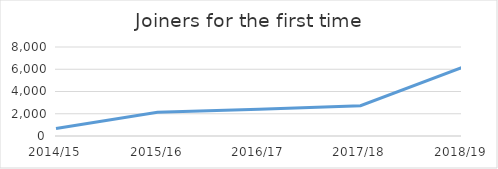
| Category | Joiners for the first time |
|---|---|
| 2014/15 | 665 |
| 2015/16 | 2135 |
| 2016/17 | 2403 |
| 2017/18 | 2724 |
| 2018/19 | 6157 |